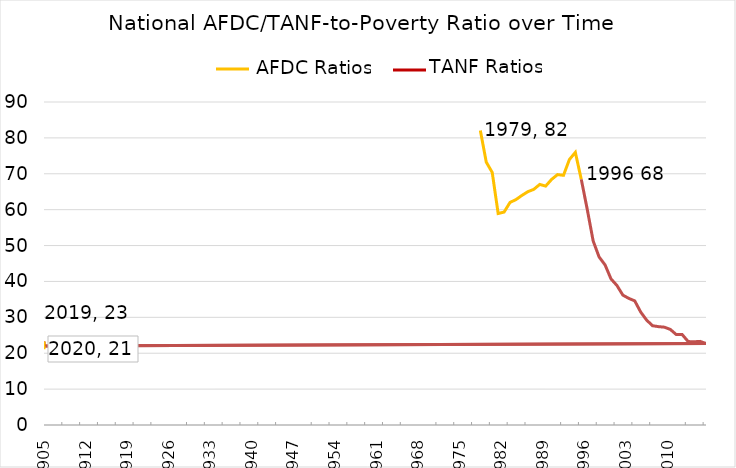
| Category | Series 0 |
|---|---|
| 1979-01-01 | 82.061 |
| 1980-01-01 | 73.245 |
| 1981-01-01 | 70.38 |
| 1982-01-01 | 58.928 |
| 1983-01-01 | 59.329 |
| 1984-01-01 | 62.017 |
| 1985-01-01 | 62.807 |
| 1986-01-01 | 63.968 |
| 1987-01-01 | 65.007 |
| 1988-01-01 | 65.658 |
| 1989-01-01 | 67.032 |
| 1990-01-01 | 66.57 |
| 1991-01-01 | 68.428 |
| 1992-01-01 | 69.77 |
| 1993-01-01 | 69.573 |
| 1994-01-01 | 73.982 |
| 1995-01-01 | 75.967 |
| 1996-01-01 | 68.434 |
| 1997-01-01 | 60.107 |
| 1998-01-01 | 51.281 |
| 1999-01-01 | 46.815 |
| 2000-01-01 | 44.625 |
| 2001-01-01 | 40.721 |
| 2002-01-01 | 38.883 |
| 2003-01-01 | 36.191 |
| 2004-01-01 | 35.279 |
| 2005-01-01 | 34.584 |
| 2006-01-01 | 31.487 |
| 2007-01-01 | 29.231 |
| 2008-01-01 | 27.663 |
| 2009-01-01 | 27.409 |
| 2010-01-01 | 27.258 |
| 2011-01-01 | 26.626 |
| 2012-01-01 | 25.192 |
| 2013-01-01 | 25.183 |
| 2014-01-01 | 23.248 |
| 2015-01-01 | 23.188 |
| 2016-01-01 | 23.299 |
| 2017-01-01 | 22.708 |
| 1905-07-10 | 22 |
| 1905-07-11 | 23.295 |
| 1905-07-12 | 21.101 |